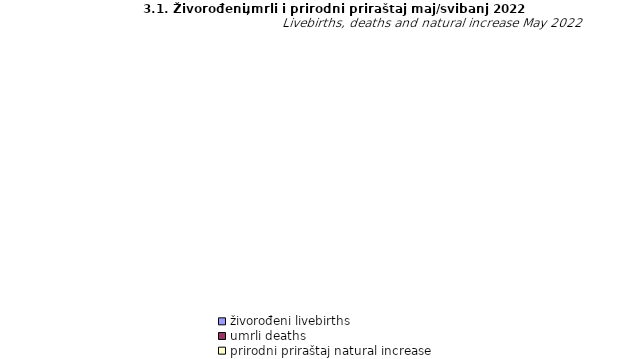
| Category | živorođeni livebirths | umrli deaths | prirodni priraštaj natural increase |
|---|---|---|---|
| Unsko - sanski | 123 | 155 | -32 |
| Kanton Posavski | 13 | 34 | -21 |
| Tuzlanski | 283 | 338 | -55 |
| Zeničko - dobojski | 246 | 298 | -52 |
| Bosansko - podrinjski | 12 | 20 | -8 |
| Srednjobosanski | 130 | 169 | -39 |
| Hercegovačko-neretvanski | 108 | 188 | -80 |
| Zapadnohercegovački | 45 | 46 | -1 |
| Kanton Sarajevo | 313 | 347 | -34 |
| Kanton 10 | 43 | 69 | -26 |